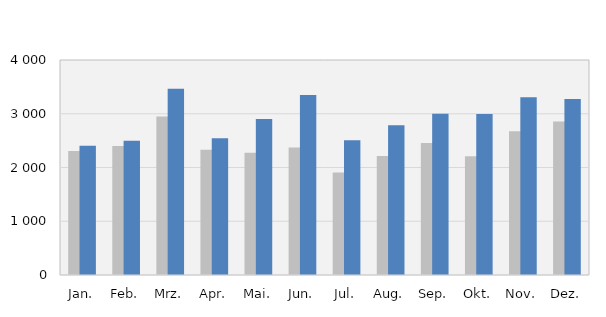
| Category | 2022 | 2023 |
|---|---|---|
| Jan. | 2308 | 2405 |
| Feb. | 2398 | 2499 |
| Mrz. | 2951 | 3465 |
| Apr. | 2328 | 2542 |
| Mai. | 2276 | 2904 |
| Jun. | 2370 | 3348 |
| Jul. | 1905 | 2505 |
| Aug. | 2212 | 2786 |
| Sep. | 2455 | 3001 |
| Okt. | 2210 | 2997 |
| Nov. | 2675 | 3305 |
| Dez. | 2854 | 3275 |